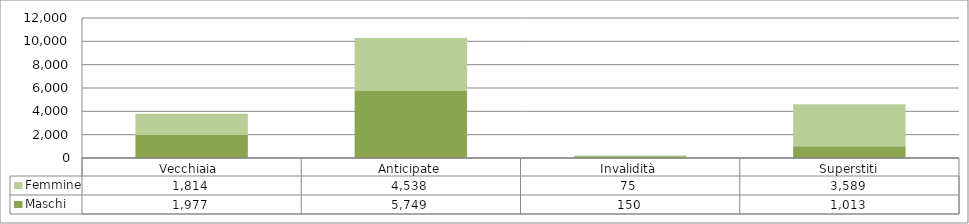
| Category | Maschi | Femmine |
|---|---|---|
| Vecchiaia  | 1977 | 1814 |
| Anticipate | 5749 | 4538 |
| Invalidità | 150 | 75 |
| Superstiti | 1013 | 3589 |